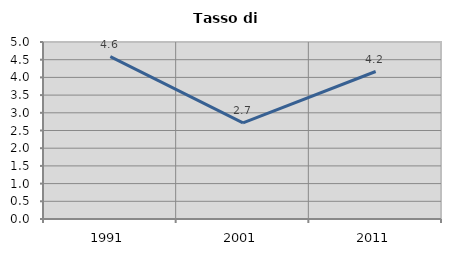
| Category | Tasso di disoccupazione   |
|---|---|
| 1991.0 | 4.586 |
| 2001.0 | 2.716 |
| 2011.0 | 4.167 |